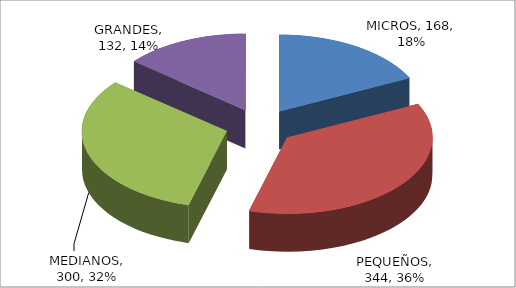
| Category | Series 0 |
|---|---|
| MICROS | 168 |
| PEQUEÑOS | 344 |
| MEDIANOS | 300 |
| GRANDES | 132 |